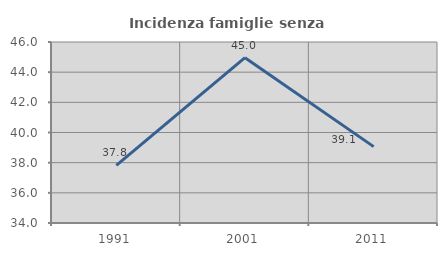
| Category | Incidenza famiglie senza nuclei |
|---|---|
| 1991.0 | 37.815 |
| 2001.0 | 44.961 |
| 2011.0 | 39.062 |